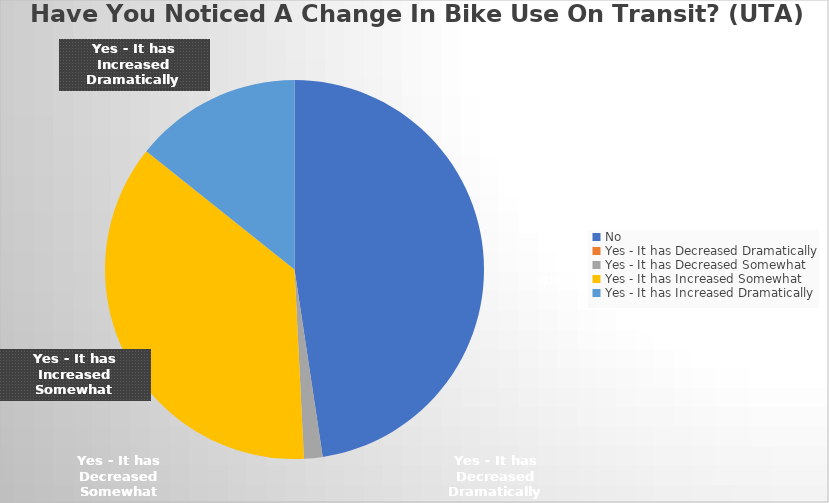
| Category | Series 0 |
|---|---|
| No | 30 |
| Yes - It has Decreased Dramatically | 0 |
| Yes - It has Decreased Somewhat | 1 |
| Yes - It has Increased Somewhat | 23 |
| Yes - It has Increased Dramatically | 9 |